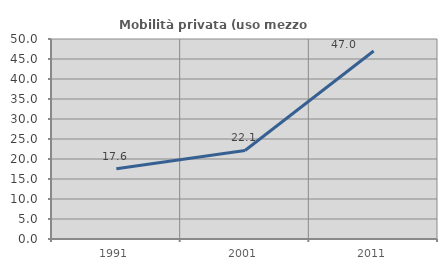
| Category | Mobilità privata (uso mezzo privato) |
|---|---|
| 1991.0 | 17.59 |
| 2001.0 | 22.133 |
| 2011.0 | 46.993 |